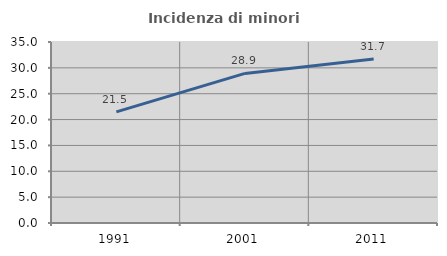
| Category | Incidenza di minori stranieri |
|---|---|
| 1991.0 | 21.477 |
| 2001.0 | 28.922 |
| 2011.0 | 31.732 |